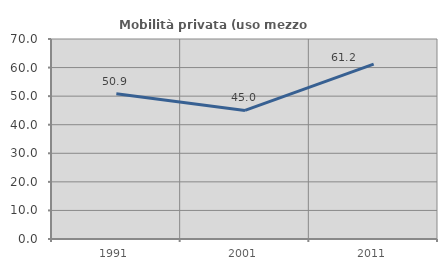
| Category | Mobilità privata (uso mezzo privato) |
|---|---|
| 1991.0 | 50.854 |
| 2001.0 | 45 |
| 2011.0 | 61.232 |